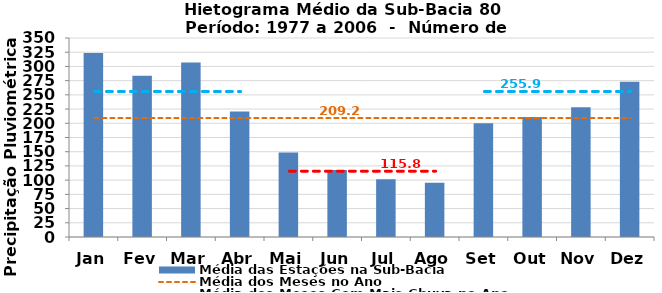
| Category | Média das Estações na Sub-Bacia |
|---|---|
| Jan | 323.599 |
| Fev | 283.746 |
| Mar | 306.791 |
| Abr | 220.788 |
| Mai | 148.43 |
| Jun | 117.856 |
| Jul | 101.456 |
| Ago | 95.278 |
| Set | 199.971 |
| Out | 211.049 |
| Nov | 228.328 |
| Dez | 273.037 |